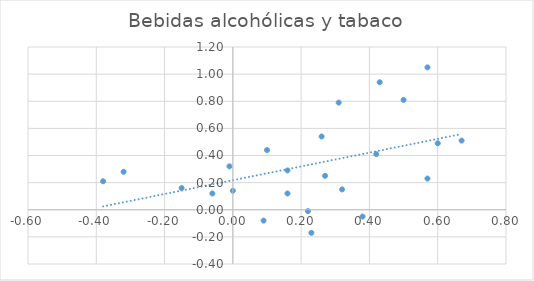
| Category | Bebidas alcohólicas y tabaco |
|---|---|
| 0.38 | -0.05 |
| -0.15 | 0.16 |
| -0.06 | 0.12 |
| 0.32 | 0.15 |
| -0.01 | 0.32 |
| 0.0 | 0.14 |
| -0.38 | 0.21 |
| -0.32 | 0.28 |
| 0.16 | 0.12 |
| 0.57 | 0.23 |
| 0.67 | 0.51 |
| 0.42 | 0.41 |
| 0.26 | 0.54 |
| 0.1 | 0.44 |
| 0.16 | 0.29 |
| 0.23 | -0.17 |
| 0.09 | -0.08 |
| 0.22 | -0.01 |
| 0.27 | 0.25 |
| 0.31 | 0.79 |
| 0.5 | 0.81 |
| 0.43 | 0.94 |
| 0.57 | 1.05 |
| 0.6 | 0.49 |